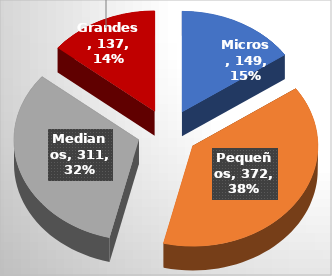
| Category | Series 0 |
|---|---|
| Micros | 149 |
| Pequeños | 372 |
| Medianos | 311 |
| Grandes | 137 |